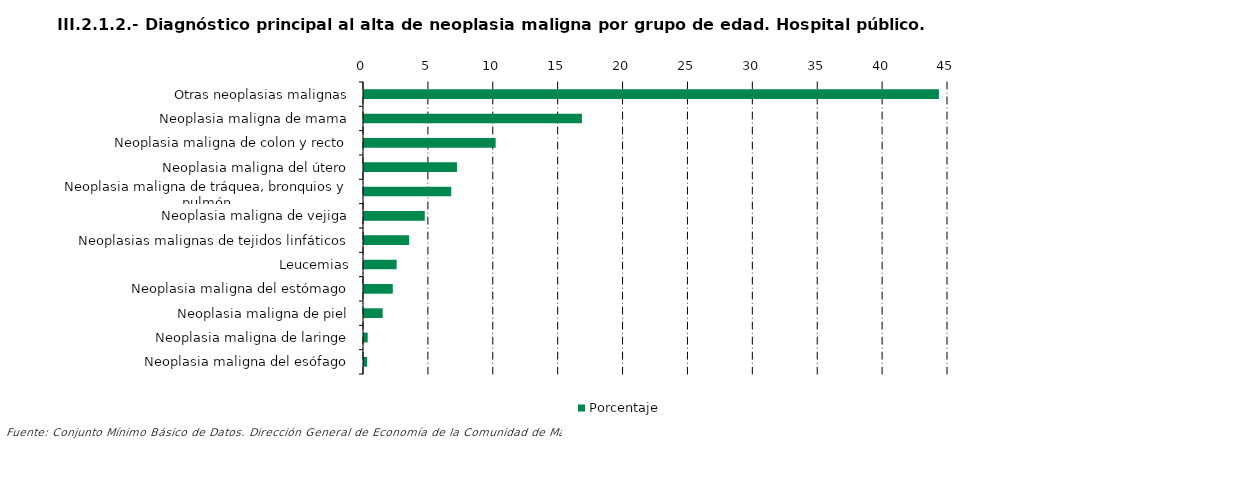
| Category | Porcentaje |
|---|---|
| Otras neoplasias malignas | 44.3 |
| Neoplasia maligna de mama | 16.79 |
| Neoplasia maligna de colon y recto | 10.144 |
| Neoplasia maligna del útero | 7.163 |
| Neoplasia maligna de tráquea, bronquios y pulmón | 6.722 |
| Neoplasia maligna de vejiga | 4.682 |
| Neoplasias malignas de tejidos linfáticos | 3.476 |
| Leucemias | 2.513 |
| Neoplasia maligna del estómago | 2.217 |
| Neoplasia maligna de piel | 1.437 |
| Neoplasia maligna de laringe | 0.285 |
| Neoplasia maligna del esófago | 0.237 |